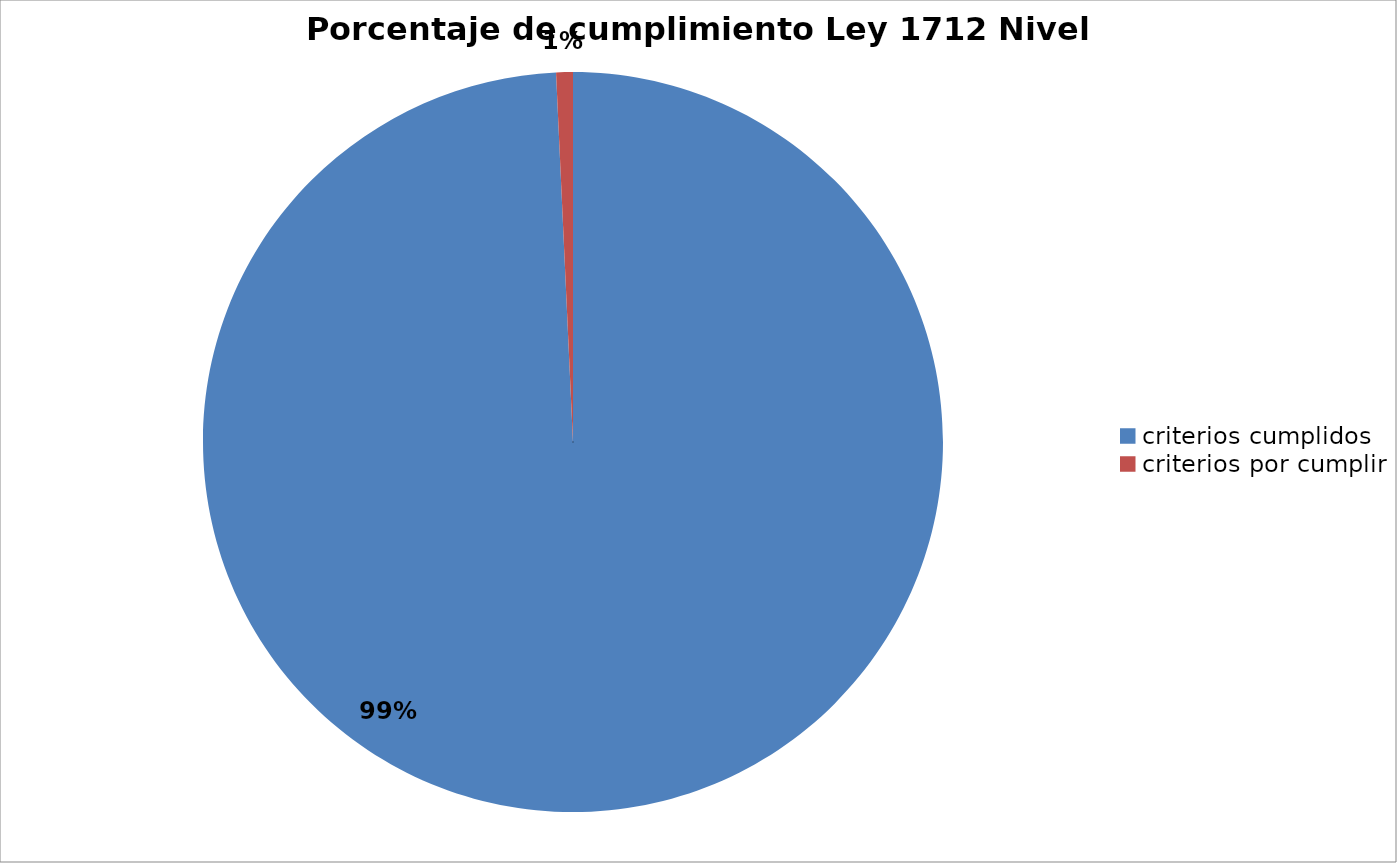
| Category | Series 0 |
|---|---|
| criterios cumplidos | 136 |
| criterios por cumplir | 1 |